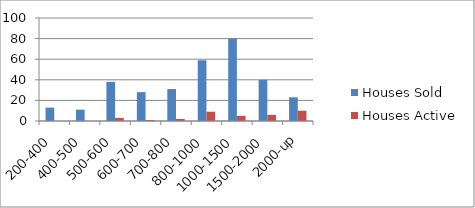
| Category | Houses Sold | Houses Active |
|---|---|---|
| 200-400 | 13 | 0 |
| 400-500 | 11 | 0 |
| 500-600 | 38 | 3 |
| 600-700 | 28 | 1 |
| 700-800 | 31 | 2 |
| 800-1000 | 59 | 9 |
| 1000-1500 | 80 | 5 |
| 1500-2000 | 40 | 6 |
| 2000-up | 23 | 10 |